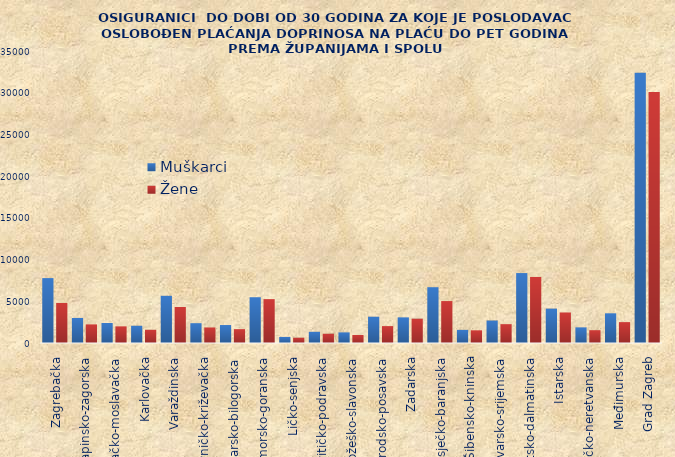
| Category | Muškarci | Žene |
|---|---|---|
| Zagrebačka | 7778 | 4803 |
| Krapinsko-zagorska | 3002 | 2230 |
| Sisačko-moslavačka | 2401 | 1995 |
| Karlovačka | 2067 | 1584 |
| Varaždinska | 5657 | 4316 |
| Koprivničko-križevačka | 2376 | 1861 |
| Bjelovarsko-bilogorska | 2154 | 1661 |
| Primorsko-goranska | 5486 | 5259 |
| Ličko-senjska | 729 | 636 |
| Virovitičko-podravska | 1343 | 1109 |
| Požeško-slavonska | 1272 | 957 |
| Brodsko-posavska | 3149 | 2025 |
| Zadarska | 3073 | 2915 |
| Osječko-baranjska | 6687 | 5026 |
| Šibensko-kninska | 1574 | 1521 |
| Vukovarsko-srijemska | 2693 | 2259 |
| Splitsko-dalmatinska | 8382 | 7916 |
| Istarska | 4120 | 3660 |
| Dubrovačko-neretvanska | 1875 | 1536 |
| Međimurska | 3561 | 2503 |
| Grad Zagreb | 32386 | 30092 |